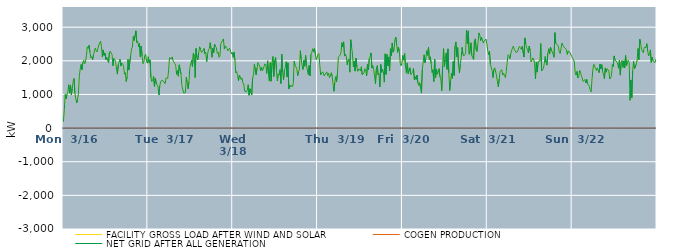
| Category | FACILITY GROSS LOAD AFTER WIND AND SOLAR | COGEN PRODUCTION | NET GRID AFTER ALL GENERATION |
|---|---|---|---|
|  Mon  3/16 | 190 | 0 | 190 |
|  Mon  3/16 | 551 | 0 | 551 |
|  Mon  3/16 | 998 | 0 | 998 |
|  Mon  3/16 | 871 | 0 | 871 |
|  Mon  3/16 | 998 | 0 | 998 |
|  Mon  3/16 | 1071 | 0 | 1071 |
|  Mon  3/16 | 1289 | 0 | 1289 |
|  Mon  3/16 | 1038 | 0 | 1038 |
|  Mon  3/16 | 1282 | 0 | 1282 |
|  Mon  3/16 | 989 | 0 | 989 |
|  Mon  3/16 | 1173 | 0 | 1173 |
|  Mon  3/16 | 1390 | 0 | 1390 |
|  Mon  3/16 | 1475 | 0 | 1475 |
|  Mon  3/16 | 1033 | 0 | 1033 |
|  Mon  3/16 | 872 | 0 | 872 |
|  Mon  3/16 | 748 | 0 | 748 |
|  Mon  3/16 | 854 | 0 | 854 |
|  Mon  3/16 | 1032 | 0 | 1032 |
|  Mon  3/16 | 1557 | 0 | 1557 |
|  Mon  3/16 | 1759 | 0 | 1759 |
|  Mon  3/16 | 1892 | 0 | 1892 |
|  Mon  3/16 | 1732 | 0 | 1732 |
|  Mon  3/16 | 1958 | 0 | 1958 |
|  Mon  3/16 | 2014 | 0 | 2014 |
|  Mon  3/16 | 1913 | 0 | 1913 |
|  Mon  3/16 | 1969 | 0 | 1969 |
|  Mon  3/16 | 2160 | 0 | 2160 |
|  Mon  3/16 | 2418 | 0 | 2418 |
|  Mon  3/16 | 2363 | 0 | 2363 |
|  Mon  3/16 | 2465 | 0 | 2465 |
|  Mon  3/16 | 2259 | 0 | 2259 |
|  Mon  3/16 | 2088 | 0 | 2088 |
|  Mon  3/16 | 2123 | 0 | 2123 |
|  Mon  3/16 | 2036 | 0 | 2036 |
|  Mon  3/16 | 2182 | 0 | 2182 |
|  Mon  3/16 | 2191 | 0 | 2191 |
|  Mon  3/16 | 2376 | 0 | 2376 |
|  Mon  3/16 | 2309 | 0 | 2309 |
|  Mon  3/16 | 2264 | 0 | 2264 |
|  Mon  3/16 | 2263 | 0 | 2263 |
|  Mon  3/16 | 2470 | 0 | 2470 |
|  Mon  3/16 | 2488 | 0 | 2488 |
|  Mon  3/16 | 2583 | 0 | 2583 |
|  Mon  3/16 | 2424 | 0 | 2424 |
|  Mon  3/16 | 2116 | 0 | 2116 |
|  Mon  3/16 | 2325 | 0 | 2325 |
|  Mon  3/16 | 2159 | 0 | 2159 |
|  Mon  3/16 | 2233 | 0 | 2233 |
|  Mon  3/16 | 2036 | 0 | 2036 |
|  Mon  3/16 | 2106 | 0 | 2106 |
|  Mon  3/16 | 2078 | 0 | 2078 |
|  Mon  3/16 | 1945 | 0 | 1945 |
|  Mon  3/16 | 2255 | 0 | 2255 |
|  Mon  3/16 | 2286 | 0 | 2286 |
|  Mon  3/16 | 2234 | 0 | 2234 |
|  Mon  3/16 | 2187 | 0 | 2187 |
|  Mon  3/16 | 1850 | 0 | 1850 |
|  Mon  3/16 | 2072 | 0 | 2072 |
|  Mon  3/16 | 2038 | 0 | 2038 |
|  Mon  3/16 | 1955 | 0 | 1955 |
|  Mon  3/16 | 1940 | 0 | 1940 |
|  Mon  3/16 | 1604 | 0 | 1604 |
|  Mon  3/16 | 1877 | 0 | 1877 |
|  Mon  3/16 | 1871 | 0 | 1871 |
|  Mon  3/16 | 2046 | 0 | 2046 |
|  Mon  3/16 | 1844 | 0 | 1844 |
|  Mon  3/16 | 1937 | 0 | 1937 |
|  Mon  3/16 | 1966 | 0 | 1966 |
|  Mon  3/16 | 1861 | 0 | 1861 |
|  Mon  3/16 | 1603 | 0 | 1603 |
|  Mon  3/16 | 1648 | 0 | 1648 |
|  Mon  3/16 | 1384 | 0 | 1384 |
|  Mon  3/16 | 1517 | 0 | 1517 |
|  Mon  3/16 | 2045 | 0 | 2045 |
|  Mon  3/16 | 1724 | 0 | 1724 |
|  Mon  3/16 | 1749 | 0 | 1749 |
|  Mon  3/16 | 2150 | 0 | 2150 |
|  Mon  3/16 | 2346 | 0 | 2346 |
|  Mon  3/16 | 2409 | 0 | 2409 |
|  Mon  3/16 | 2723 | 0 | 2723 |
|  Mon  3/16 | 2602 | 0 | 2602 |
|  Mon  3/16 | 2599 | 0 | 2599 |
|  Mon  3/16 | 2892 | 0 | 2892 |
|  Mon  3/16 | 2543 | 0 | 2543 |
|  Mon  3/16 | 2584 | 0 | 2584 |
|  Mon  3/16 | 2419 | 0 | 2419 |
|  Mon  3/16 | 2514 | 0 | 2514 |
|  Mon  3/16 | 2117 | 0 | 2117 |
|  Mon  3/16 | 2440 | 0 | 2440 |
|  Mon  3/16 | 2133 | 0 | 2133 |
|  Mon  3/16 | 1913 | 0 | 1913 |
|  Mon  3/16 | 1972 | 0 | 1972 |
|  Mon  3/16 | 2156 | 0 | 2156 |
|  Mon  3/16 | 2198 | 0 | 2198 |
|  Mon  3/16 | 1978 | 0 | 1978 |
|  Mon  3/16 | 1931 | 0 | 1931 |
|  Tue  3/17 | 2121 | 0 | 2121 |
|  Tue  3/17 | 1933 | 0 | 1933 |
|  Tue  3/17 | 2028 | 0 | 2028 |
|  Tue  3/17 | 1499 | 0 | 1499 |
|  Tue  3/17 | 1384 | 0 | 1384 |
|  Tue  3/17 | 1421 | 0 | 1421 |
|  Tue  3/17 | 1540 | 0 | 1540 |
|  Tue  3/17 | 1237 | 0 | 1237 |
|  Tue  3/17 | 1482 | 0 | 1482 |
|  Tue  3/17 | 1341 | 0 | 1341 |
|  Tue  3/17 | 1277 | 0 | 1277 |
|  Tue  3/17 | 1228 | 0 | 1228 |
|  Tue  3/17 | 984 | 0 | 984 |
|  Tue  3/17 | 1266 | 0 | 1266 |
|  Tue  3/17 | 1383 | 0 | 1383 |
|  Tue  3/17 | 1419 | 0 | 1419 |
|  Tue  3/17 | 1399 | 0 | 1399 |
|  Tue  3/17 | 1397 | 0 | 1397 |
|  Tue  3/17 | 1389 | 0 | 1389 |
|  Tue  3/17 | 1321 | 0 | 1321 |
|  Tue  3/17 | 1488 | 0 | 1488 |
|  Tue  3/17 | 1466 | 0 | 1466 |
|  Tue  3/17 | 1480 | 0 | 1480 |
|  Tue  3/17 | 1721 | 0 | 1721 |
|  Tue  3/17 | 2093 | 0 | 2093 |
|  Tue  3/17 | 2068 | 0 | 2068 |
|  Tue  3/17 | 2057 | 0 | 2057 |
|  Tue  3/17 | 2117 | 0 | 2117 |
|  Tue  3/17 | 2003 | 0 | 2003 |
|  Tue  3/17 | 2019 | 0 | 2019 |
|  Tue  3/17 | 1918 | 0 | 1918 |
|  Tue  3/17 | 1860 | 0 | 1860 |
|  Tue  3/17 | 1598 | 0 | 1598 |
|  Tue  3/17 | 1708 | 0 | 1708 |
|  Tue  3/17 | 1542 | 0 | 1542 |
|  Tue  3/17 | 1881 | 0 | 1881 |
|  Tue  3/17 | 1890 | 0 | 1890 |
|  Tue  3/17 | 1606 | 0 | 1606 |
|  Tue  3/17 | 1262 | 0 | 1262 |
|  Tue  3/17 | 1269 | 0 | 1269 |
|  Tue  3/17 | 1046 | 0 | 1046 |
|  Tue  3/17 | 1018 | 0 | 1018 |
|  Tue  3/17 | 1055 | 0 | 1055 |
|  Tue  3/17 | 1518 | 0 | 1518 |
|  Tue  3/17 | 1353 | 0 | 1353 |
|  Tue  3/17 | 1169 | 0 | 1169 |
|  Tue  3/17 | 1368 | 0 | 1368 |
|  Tue  3/17 | 1798 | 0 | 1798 |
|  Tue  3/17 | 1904 | 0 | 1904 |
|  Tue  3/17 | 2016 | 0 | 2016 |
|  Tue  3/17 | 1831 | 0 | 1831 |
|  Tue  3/17 | 2224 | 0 | 2224 |
|  Tue  3/17 | 2151 | 0 | 2151 |
|  Tue  3/17 | 1502 | 0 | 1502 |
|  Tue  3/17 | 2368 | 0 | 2368 |
|  Tue  3/17 | 2102 | 0 | 2102 |
|  Tue  3/17 | 2030 | 0 | 2030 |
|  Tue  3/17 | 2228 | 0 | 2228 |
|  Tue  3/17 | 2414 | 0 | 2414 |
|  Tue  3/17 | 2346 | 0 | 2346 |
|  Tue  3/17 | 2252 | 0 | 2252 |
|  Tue  3/17 | 2233 | 0 | 2233 |
|  Tue  3/17 | 2293 | 0 | 2293 |
|  Tue  3/17 | 2368 | 0 | 2368 |
|  Tue  3/17 | 2205 | 0 | 2205 |
|  Tue  3/17 | 2253 | 0 | 2253 |
|  Tue  3/17 | 1973 | 0 | 1973 |
|  Tue  3/17 | 2182 | 0 | 2182 |
|  Tue  3/17 | 2325 | 0 | 2325 |
|  Tue  3/17 | 2359 | 0 | 2359 |
|  Tue  3/17 | 2540 | 0 | 2540 |
|  Tue  3/17 | 2353 | 0 | 2353 |
|  Tue  3/17 | 2105 | 0 | 2105 |
|  Tue  3/17 | 2376 | 0 | 2376 |
|  Tue  3/17 | 2242 | 0 | 2242 |
|  Tue  3/17 | 2491 | 0 | 2491 |
|  Tue  3/17 | 2427 | 0 | 2427 |
|  Tue  3/17 | 2390 | 0 | 2390 |
|  Tue  3/17 | 2221 | 0 | 2221 |
|  Tue  3/17 | 2259 | 0 | 2259 |
|  Tue  3/17 | 2106 | 0 | 2106 |
|  Tue  3/17 | 2139 | 0 | 2139 |
|  Tue  3/17 | 2513 | 0 | 2513 |
|  Tue  3/17 | 2520 | 0 | 2520 |
|  Tue  3/17 | 2606 | 0 | 2606 |
|  Tue  3/17 | 2653 | 0 | 2653 |
|  Tue  3/17 | 2350 | 0 | 2350 |
|  Tue  3/17 | 2443 | 0 | 2443 |
|  Tue  3/17 | 2464 | 0 | 2464 |
|  Tue  3/17 | 2363 | 0 | 2363 |
|  Tue  3/17 | 2297 | 0 | 2297 |
|  Tue  3/17 | 2295 | 0 | 2295 |
|  Tue  3/17 | 2374 | 0 | 2374 |
|  Tue  3/17 | 2354 | 0 | 2354 |
|  Tue  3/17 | 2205 | 0 | 2205 |
|  Tue  3/17 | 2246 | 0 | 2246 |
|  Wed  3/18 | 2103 | 0 | 2103 |
|  Wed  3/18 | 2259 | 0 | 2259 |
|  Wed  3/18 | 2031 | 0 | 2031 |
|  Wed  3/18 | 1640 | 0 | 1640 |
|  Wed  3/18 | 1681 | 0 | 1681 |
|  Wed  3/18 | 1561 | 0 | 1561 |
|  Wed  3/18 | 1412 | 0 | 1412 |
|  Wed  3/18 | 1575 | 0 | 1575 |
|  Wed  3/18 | 1539 | 0 | 1539 |
|  Wed  3/18 | 1445 | 0 | 1445 |
|  Wed  3/18 | 1490 | 0 | 1490 |
|  Wed  3/18 | 1343 | 0 | 1343 |
|  Wed  3/18 | 1310 | 0 | 1310 |
|  Wed  3/18 | 1099 | 0 | 1099 |
|  Wed  3/18 | 1074 | 0 | 1074 |
|  Wed  3/18 | 1073 | 0 | 1073 |
|  Wed  3/18 | 1130 | 0 | 1130 |
|  Wed  3/18 | 1291 | 0 | 1291 |
|  Wed  3/18 | 975 | 0 | 975 |
|  Wed  3/18 | 1171 | 0 | 1171 |
|  Wed  3/18 | 1143 | 0 | 1143 |
|  Wed  3/18 | 984 | 0 | 984 |
|  Wed  3/18 | 1482 | 0 | 1482 |
|  Wed  3/18 | 1587 | 0 | 1587 |
|  Wed  3/18 | 1894 | 0 | 1894 |
|  Wed  3/18 | 1888 | 0 | 1888 |
|  Wed  3/18 | 1586 | 0 | 1586 |
|  Wed  3/18 | 1784 | 0 | 1784 |
|  Wed  3/18 | 1950 | 0 | 1950 |
|  Wed  3/18 | 1889 | 0 | 1889 |
|  Wed  3/18 | 1839 | 0 | 1839 |
|  Wed  3/18 | 1712 | 0 | 1712 |
|  Wed  3/18 | 1816 | 0 | 1816 |
|  Wed  3/18 | 1709 | 0 | 1709 |
|  Wed  3/18 | 1750 | 0 | 1750 |
|  Wed  3/18 | 1841 | 0 | 1841 |
|  Wed  3/18 | 1909 | 0 | 1909 |
|  Wed  3/18 | 1874 | 0 | 1874 |
|  Wed  3/18 | 1627 | 0 | 1627 |
|  Wed  3/18 | 1999 | 0 | 1999 |
|  Wed  3/18 | 1989 | 0 | 1989 |
|  Wed  3/18 | 1397 | 0 | 1397 |
|  Wed  3/18 | 1945 | 0 | 1945 |
|  Wed  3/18 | 1393 | 0 | 1393 |
|  Wed  3/18 | 1947 | 0 | 1947 |
|  Wed  3/18 | 2129 | 0 | 2129 |
|  Wed  3/18 | 1534 | 0 | 1534 |
|  Wed  3/18 | 1994 | 0 | 1994 |
|  Wed  3/18 | 2101 | 0 | 2101 |
|  Wed  3/18 | 1716 | 0 | 1716 |
|  Wed  3/18 | 1402 | 0 | 1402 |
|  Wed  3/18 | 1612 | 0 | 1612 |
|  Wed  3/18 | 1582 | 0 | 1582 |
|  Wed  3/18 | 1740 | 0 | 1740 |
|  Wed  3/18 | 1324 | 0 | 1324 |
|  Wed  3/18 | 2195 | 0 | 2195 |
|  Wed  3/18 | 1665 | 0 | 1665 |
|  Wed  3/18 | 1440 | 0 | 1440 |
|  Wed  3/18 | 1716 | 0 | 1716 |
|  Wed  3/18 | 1804 | 0 | 1804 |
|  Wed  3/18 | 1973 | 0 | 1973 |
|  Wed  3/18 | 1518 | 0 | 1518 |
|  Wed  3/18 | 1942 | 0 | 1942 |
|  Wed  3/18 | 1163 | 0 | 1163 |
|  Wed  3/18 | 1284 | 0 | 1284 |
|  Wed  3/18 | 1229 | 0 | 1229 |
|  Wed  3/18 | 1265 | 0 | 1265 |
|  Wed  3/18 | 1228 | 0 | 1228 |
|  Wed  3/18 | 1322 | 0 | 1322 |
|  Wed  3/18 | 1987 | 0 | 1987 |
|  Wed  3/18 | 1869 | 0 | 1869 |
|  Wed  3/18 | 1844 | 0 | 1844 |
|  Wed  3/18 | 1769 | 0 | 1769 |
|  Wed  3/18 | 1560 | 0 | 1560 |
|  Wed  3/18 | 1673 | 0 | 1673 |
|  Wed  3/18 | 1752 | 0 | 1752 |
|  Wed  3/18 | 2300 | 0 | 2300 |
|  Wed  3/18 | 2047 | 0 | 2047 |
|  Wed  3/18 | 1862 | 0 | 1862 |
|  Wed  3/18 | 1741 | 0 | 1741 |
|  Wed  3/18 | 2011 | 0 | 2011 |
|  Wed  3/18 | 1838 | 0 | 1838 |
|  Wed  3/18 | 2158 | 0 | 2158 |
|  Wed  3/18 | 1860 | 0 | 1860 |
|  Wed  3/18 | 1843 | 0 | 1843 |
|  Wed  3/18 | 1590 | 0 | 1590 |
|  Wed  3/18 | 1861 | 0 | 1861 |
|  Wed  3/18 | 1552 | 0 | 1552 |
|  Wed  3/18 | 2191 | 0 | 2191 |
|  Wed  3/18 | 2252 | 0 | 2252 |
|  Wed  3/18 | 2358 | 0 | 2358 |
|  Wed  3/18 | 2265 | 0 | 2265 |
|  Wed  3/18 | 2363 | 0 | 2363 |
|  Wed  3/18 | 2200 | 0 | 2200 |
|  Wed  3/18 | 2038 | 0 | 2038 |
|  Wed  3/18 | 2098 | 0 | 2098 |
|  Thu  3/19 | 2187 | 0 | 2187 |
|  Thu  3/19 | 2217 | 0 | 2217 |
|  Thu  3/19 | 1882 | 0 | 1882 |
|  Thu  3/19 | 1579 | 0 | 1579 |
|  Thu  3/19 | 1596 | 0 | 1596 |
|  Thu  3/19 | 1674 | 0 | 1674 |
|  Thu  3/19 | 1641 | 0 | 1641 |
|  Thu  3/19 | 1548 | 0 | 1548 |
|  Thu  3/19 | 1599 | 0 | 1599 |
|  Thu  3/19 | 1617 | 0 | 1617 |
|  Thu  3/19 | 1672 | 0 | 1672 |
|  Thu  3/19 | 1560 | 0 | 1560 |
|  Thu  3/19 | 1632 | 0 | 1632 |
|  Thu  3/19 | 1493 | 0 | 1493 |
|  Thu  3/19 | 1538 | 0 | 1538 |
|  Thu  3/19 | 1645 | 0 | 1645 |
|  Thu  3/19 | 1543 | 0 | 1543 |
|  Thu  3/19 | 1544 | 0 | 1544 |
|  Thu  3/19 | 1095 | 0 | 1095 |
|  Thu  3/19 | 1359 | 0 | 1359 |
|  Thu  3/19 | 1528 | 0 | 1528 |
|  Thu  3/19 | 1380 | 0 | 1380 |
|  Thu  3/19 | 1621 | 0 | 1621 |
|  Thu  3/19 | 2106 | 0 | 2106 |
|  Thu  3/19 | 2078 | 0 | 2078 |
|  Thu  3/19 | 2171 | 0 | 2171 |
|  Thu  3/19 | 2244 | 0 | 2244 |
|  Thu  3/19 | 2541 | 0 | 2541 |
|  Thu  3/19 | 2413 | 0 | 2413 |
|  Thu  3/19 | 2566 | 0 | 2566 |
|  Thu  3/19 | 2140 | 0 | 2140 |
|  Thu  3/19 | 2201 | 0 | 2201 |
|  Thu  3/19 | 2136 | 0 | 2136 |
|  Thu  3/19 | 1883 | 0 | 1883 |
|  Thu  3/19 | 2012 | 0 | 2012 |
|  Thu  3/19 | 2058 | 0 | 2058 |
|  Thu  3/19 | 1662 | 0 | 1662 |
|  Thu  3/19 | 2627 | 0 | 2627 |
|  Thu  3/19 | 2416 | 0 | 2416 |
|  Thu  3/19 | 2197 | 0 | 2197 |
|  Thu  3/19 | 1823 | 0 | 1823 |
|  Thu  3/19 | 1993 | 0 | 1993 |
|  Thu  3/19 | 1693 | 0 | 1693 |
|  Thu  3/19 | 2083 | 0 | 2083 |
|  Thu  3/19 | 1817 | 0 | 1817 |
|  Thu  3/19 | 1687 | 0 | 1687 |
|  Thu  3/19 | 1763 | 0 | 1763 |
|  Thu  3/19 | 1785 | 0 | 1785 |
|  Thu  3/19 | 1702 | 0 | 1702 |
|  Thu  3/19 | 1824 | 0 | 1824 |
|  Thu  3/19 | 1588 | 0 | 1588 |
|  Thu  3/19 | 1584 | 0 | 1584 |
|  Thu  3/19 | 1639 | 0 | 1639 |
|  Thu  3/19 | 1766 | 0 | 1766 |
|  Thu  3/19 | 1735 | 0 | 1735 |
|  Thu  3/19 | 1551 | 0 | 1551 |
|  Thu  3/19 | 1897 | 0 | 1897 |
|  Thu  3/19 | 1733 | 0 | 1733 |
|  Thu  3/19 | 2065 | 0 | 2065 |
|  Thu  3/19 | 2134 | 0 | 2134 |
|  Thu  3/19 | 2237 | 0 | 2237 |
|  Thu  3/19 | 1783 | 0 | 1783 |
|  Thu  3/19 | 1857 | 0 | 1857 |
|  Thu  3/19 | 1744 | 0 | 1744 |
|  Thu  3/19 | 1537 | 0 | 1537 |
|  Thu  3/19 | 1321 | 0 | 1321 |
|  Thu  3/19 | 1748 | 0 | 1748 |
|  Thu  3/19 | 1858 | 0 | 1858 |
|  Thu  3/19 | 1582 | 0 | 1582 |
|  Thu  3/19 | 1615 | 0 | 1615 |
|  Thu  3/19 | 1223 | 0 | 1223 |
|  Thu  3/19 | 1890 | 0 | 1890 |
|  Thu  3/19 | 1655 | 0 | 1655 |
|  Thu  3/19 | 1754 | 0 | 1754 |
|  Thu  3/19 | 1670 | 0 | 1670 |
|  Thu  3/19 | 1365 | 0 | 1365 |
|  Thu  3/19 | 2209 | 0 | 2209 |
|  Thu  3/19 | 1595 | 0 | 1595 |
|  Thu  3/19 | 2191 | 0 | 2191 |
|  Thu  3/19 | 1849 | 0 | 1849 |
|  Thu  3/19 | 2116 | 0 | 2116 |
|  Thu  3/19 | 1708 | 0 | 1708 |
|  Thu  3/19 | 2359 | 0 | 2359 |
|  Thu  3/19 | 2144 | 0 | 2144 |
|  Thu  3/19 | 2532 | 0 | 2532 |
|  Thu  3/19 | 2256 | 0 | 2256 |
|  Thu  3/19 | 2340 | 0 | 2340 |
|  Thu  3/19 | 2635 | 0 | 2635 |
|  Thu  3/19 | 2705 | 0 | 2705 |
|  Thu  3/19 | 2483 | 0 | 2483 |
|  Thu  3/19 | 2248 | 0 | 2248 |
|  Thu  3/19 | 2410 | 0 | 2410 |
|  Thu  3/19 | 2279 | 0 | 2279 |
|  Thu  3/19 | 1927 | 0 | 1927 |
|  Thu  3/19 | 1854 | 0 | 1854 |
|  Thu  3/19 | 1941 | 0 | 1941 |
|  Fri  3/20 | 2161 | 0 | 2161 |
|  Fri  3/20 | 2020 | 0 | 2020 |
|  Fri  3/20 | 2217 | 0 | 2217 |
|  Fri  3/20 | 1818 | 0 | 1818 |
|  Fri  3/20 | 1633 | 0 | 1633 |
|  Fri  3/20 | 1937 | 0 | 1937 |
|  Fri  3/20 | 1617 | 0 | 1617 |
|  Fri  3/20 | 1646 | 0 | 1646 |
|  Fri  3/20 | 1792 | 0 | 1792 |
|  Fri  3/20 | 1596 | 0 | 1596 |
|  Fri  3/20 | 1613 | 0 | 1613 |
|  Fri  3/20 | 1654 | 0 | 1654 |
|  Fri  3/20 | 1772 | 0 | 1772 |
|  Fri  3/20 | 1441 | 0 | 1441 |
|  Fri  3/20 | 1527 | 0 | 1527 |
|  Fri  3/20 | 1442 | 0 | 1442 |
|  Fri  3/20 | 1572 | 0 | 1572 |
|  Fri  3/20 | 1341 | 0 | 1341 |
|  Fri  3/20 | 1268 | 0 | 1268 |
|  Fri  3/20 | 1349 | 0 | 1349 |
|  Fri  3/20 | 1195 | 0 | 1195 |
|  Fri  3/20 | 1040 | 0 | 1040 |
|  Fri  3/20 | 1746 | 0 | 1746 |
|  Fri  3/20 | 1768 | 0 | 1768 |
|  Fri  3/20 | 2179 | 0 | 2179 |
|  Fri  3/20 | 1943 | 0 | 1943 |
|  Fri  3/20 | 2072 | 0 | 2072 |
|  Fri  3/20 | 2302 | 0 | 2302 |
|  Fri  3/20 | 2161 | 0 | 2161 |
|  Fri  3/20 | 2401 | 0 | 2401 |
|  Fri  3/20 | 2031 | 0 | 2031 |
|  Fri  3/20 | 2119 | 0 | 2119 |
|  Fri  3/20 | 1912 | 0 | 1912 |
|  Fri  3/20 | 1656 | 0 | 1656 |
|  Fri  3/20 | 1733 | 0 | 1733 |
|  Fri  3/20 | 1383 | 0 | 1383 |
|  Fri  3/20 | 2042 | 0 | 2042 |
|  Fri  3/20 | 1496 | 0 | 1496 |
|  Fri  3/20 | 1757 | 0 | 1757 |
|  Fri  3/20 | 1598 | 0 | 1598 |
|  Fri  3/20 | 1656 | 0 | 1656 |
|  Fri  3/20 | 1768 | 0 | 1768 |
|  Fri  3/20 | 1517 | 0 | 1517 |
|  Fri  3/20 | 1453 | 0 | 1453 |
|  Fri  3/20 | 1114 | 0 | 1114 |
|  Fri  3/20 | 1847 | 0 | 1847 |
|  Fri  3/20 | 2364 | 0 | 2364 |
|  Fri  3/20 | 1823 | 0 | 1823 |
|  Fri  3/20 | 2043 | 0 | 2043 |
|  Fri  3/20 | 2236 | 0 | 2236 |
|  Fri  3/20 | 1745 | 0 | 1745 |
|  Fri  3/20 | 2356 | 0 | 2356 |
|  Fri  3/20 | 1640 | 0 | 1640 |
|  Fri  3/20 | 1119 | 0 | 1119 |
|  Fri  3/20 | 1400 | 0 | 1400 |
|  Fri  3/20 | 1628 | 0 | 1628 |
|  Fri  3/20 | 1478 | 0 | 1478 |
|  Fri  3/20 | 1977 | 0 | 1977 |
|  Fri  3/20 | 1564 | 0 | 1564 |
|  Fri  3/20 | 2436 | 0 | 2436 |
|  Fri  3/20 | 2562 | 0 | 2562 |
|  Fri  3/20 | 2119 | 0 | 2119 |
|  Fri  3/20 | 2392 | 0 | 2392 |
|  Fri  3/20 | 1854 | 0 | 1854 |
|  Fri  3/20 | 1637 | 0 | 1637 |
|  Fri  3/20 | 1907 | 0 | 1907 |
|  Fri  3/20 | 2096 | 0 | 2096 |
|  Fri  3/20 | 2402 | 0 | 2402 |
|  Fri  3/20 | 2182 | 0 | 2182 |
|  Fri  3/20 | 2146 | 0 | 2146 |
|  Fri  3/20 | 2130 | 0 | 2130 |
|  Fri  3/20 | 2225 | 0 | 2225 |
|  Fri  3/20 | 2913 | 0 | 2913 |
|  Fri  3/20 | 2510 | 0 | 2510 |
|  Fri  3/20 | 2891 | 0 | 2891 |
|  Fri  3/20 | 2192 | 0 | 2192 |
|  Fri  3/20 | 2237 | 0 | 2237 |
|  Fri  3/20 | 2538 | 0 | 2538 |
|  Fri  3/20 | 2154 | 0 | 2154 |
|  Fri  3/20 | 2129 | 0 | 2129 |
|  Fri  3/20 | 2040 | 0 | 2040 |
|  Fri  3/20 | 2589 | 0 | 2589 |
|  Fri  3/20 | 2657 | 0 | 2657 |
|  Fri  3/20 | 2320 | 0 | 2320 |
|  Fri  3/20 | 2270 | 0 | 2270 |
|  Fri  3/20 | 2544 | 0 | 2544 |
|  Fri  3/20 | 2830 | 0 | 2830 |
|  Fri  3/20 | 2767 | 0 | 2767 |
|  Fri  3/20 | 2600 | 0 | 2600 |
|  Fri  3/20 | 2700 | 0 | 2700 |
|  Fri  3/20 | 2620 | 0 | 2620 |
|  Fri  3/20 | 2529 | 0 | 2529 |
|  Fri  3/20 | 2590 | 0 | 2590 |
|  Fri  3/20 | 2576 | 0 | 2576 |
|  Fri  3/20 | 2646 | 0 | 2646 |
|  Fri  3/20 | 2517 | 0 | 2517 |
|  Sat  3/21 | 2306 | 0 | 2306 |
|  Sat  3/21 | 2186 | 0 | 2186 |
|  Sat  3/21 | 2285 | 0 | 2285 |
|  Sat  3/21 | 1893 | 0 | 1893 |
|  Sat  3/21 | 1866 | 0 | 1866 |
|  Sat  3/21 | 1715 | 0 | 1715 |
|  Sat  3/21 | 1501 | 0 | 1501 |
|  Sat  3/21 | 1741 | 0 | 1741 |
|  Sat  3/21 | 1791 | 0 | 1791 |
|  Sat  3/21 | 1810 | 0 | 1810 |
|  Sat  3/21 | 1551 | 0 | 1551 |
|  Sat  3/21 | 1375 | 0 | 1375 |
|  Sat  3/21 | 1225 | 0 | 1225 |
|  Sat  3/21 | 1464 | 0 | 1464 |
|  Sat  3/21 | 1693 | 0 | 1693 |
|  Sat  3/21 | 1666 | 0 | 1666 |
|  Sat  3/21 | 1735 | 0 | 1735 |
|  Sat  3/21 | 1574 | 0 | 1574 |
|  Sat  3/21 | 1626 | 0 | 1626 |
|  Sat  3/21 | 1565 | 0 | 1565 |
|  Sat  3/21 | 1500 | 0 | 1500 |
|  Sat  3/21 | 1684 | 0 | 1684 |
|  Sat  3/21 | 1952 | 0 | 1952 |
|  Sat  3/21 | 2182 | 0 | 2182 |
|  Sat  3/21 | 2150 | 0 | 2150 |
|  Sat  3/21 | 2064 | 0 | 2064 |
|  Sat  3/21 | 2210 | 0 | 2210 |
|  Sat  3/21 | 2299 | 0 | 2299 |
|  Sat  3/21 | 2389 | 0 | 2389 |
|  Sat  3/21 | 2436 | 0 | 2436 |
|  Sat  3/21 | 2344 | 0 | 2344 |
|  Sat  3/21 | 2339 | 0 | 2339 |
|  Sat  3/21 | 2250 | 0 | 2250 |
|  Sat  3/21 | 2230 | 0 | 2230 |
|  Sat  3/21 | 2280 | 0 | 2280 |
|  Sat  3/21 | 2395 | 0 | 2395 |
|  Sat  3/21 | 2430 | 0 | 2430 |
|  Sat  3/21 | 2371 | 0 | 2371 |
|  Sat  3/21 | 2341 | 0 | 2341 |
|  Sat  3/21 | 2432 | 0 | 2432 |
|  Sat  3/21 | 2453 | 0 | 2453 |
|  Sat  3/21 | 2113 | 0 | 2113 |
|  Sat  3/21 | 2682 | 0 | 2682 |
|  Sat  3/21 | 2504 | 0 | 2504 |
|  Sat  3/21 | 2388 | 0 | 2388 |
|  Sat  3/21 | 2333 | 0 | 2333 |
|  Sat  3/21 | 2236 | 0 | 2236 |
|  Sat  3/21 | 2436 | 0 | 2436 |
|  Sat  3/21 | 2303 | 0 | 2303 |
|  Sat  3/21 | 1964 | 0 | 1964 |
|  Sat  3/21 | 2014 | 0 | 2014 |
|  Sat  3/21 | 2088 | 0 | 2088 |
|  Sat  3/21 | 2054 | 0 | 2054 |
|  Sat  3/21 | 1927 | 0 | 1927 |
|  Sat  3/21 | 1464 | 0 | 1464 |
|  Sat  3/21 | 1966 | 0 | 1966 |
|  Sat  3/21 | 1665 | 0 | 1665 |
|  Sat  3/21 | 1968 | 0 | 1968 |
|  Sat  3/21 | 1955 | 0 | 1955 |
|  Sat  3/21 | 1994 | 0 | 1994 |
|  Sat  3/21 | 2514 | 0 | 2514 |
|  Sat  3/21 | 1699 | 0 | 1699 |
|  Sat  3/21 | 1687 | 0 | 1687 |
|  Sat  3/21 | 1771 | 0 | 1771 |
|  Sat  3/21 | 1922 | 0 | 1922 |
|  Sat  3/21 | 2130 | 0 | 2130 |
|  Sat  3/21 | 1945 | 0 | 1945 |
|  Sat  3/21 | 1871 | 0 | 1871 |
|  Sat  3/21 | 2226 | 0 | 2226 |
|  Sat  3/21 | 2358 | 0 | 2358 |
|  Sat  3/21 | 2202 | 0 | 2202 |
|  Sat  3/21 | 2408 | 0 | 2408 |
|  Sat  3/21 | 2323 | 0 | 2323 |
|  Sat  3/21 | 2316 | 0 | 2316 |
|  Sat  3/21 | 2194 | 0 | 2194 |
|  Sat  3/21 | 2106 | 0 | 2106 |
|  Sat  3/21 | 2839 | 0 | 2839 |
|  Sat  3/21 | 2515 | 0 | 2515 |
|  Sat  3/21 | 2530 | 0 | 2530 |
|  Sat  3/21 | 2473 | 0 | 2473 |
|  Sat  3/21 | 2416 | 0 | 2416 |
|  Sat  3/21 | 2264 | 0 | 2264 |
|  Sat  3/21 | 2219 | 0 | 2219 |
|  Sat  3/21 | 2378 | 0 | 2378 |
|  Sat  3/21 | 2531 | 0 | 2531 |
|  Sat  3/21 | 2461 | 0 | 2461 |
|  Sat  3/21 | 2459 | 0 | 2459 |
|  Sat  3/21 | 2385 | 0 | 2385 |
|  Sat  3/21 | 2386 | 0 | 2386 |
|  Sat  3/21 | 2337 | 0 | 2337 |
|  Sat  3/21 | 2191 | 0 | 2191 |
|  Sat  3/21 | 2290 | 0 | 2290 |
|  Sat  3/21 | 2280 | 0 | 2280 |
|  Sat  3/21 | 2252 | 0 | 2252 |
|  Sat  3/21 | 2259 | 0 | 2259 |
|  Sat  3/21 | 2127 | 0 | 2127 |
|  Sun  3/22 | 2101 | 0 | 2101 |
|  Sun  3/22 | 2037 | 0 | 2037 |
|  Sun  3/22 | 1964 | 0 | 1964 |
|  Sun  3/22 | 1637 | 0 | 1637 |
|  Sun  3/22 | 1572 | 0 | 1572 |
|  Sun  3/22 | 1687 | 0 | 1687 |
|  Sun  3/22 | 1487 | 0 | 1487 |
|  Sun  3/22 | 1533 | 0 | 1533 |
|  Sun  3/22 | 1717 | 0 | 1717 |
|  Sun  3/22 | 1658 | 0 | 1658 |
|  Sun  3/22 | 1552 | 0 | 1552 |
|  Sun  3/22 | 1574 | 0 | 1574 |
|  Sun  3/22 | 1385 | 0 | 1385 |
|  Sun  3/22 | 1387 | 0 | 1387 |
|  Sun  3/22 | 1447 | 0 | 1447 |
|  Sun  3/22 | 1341 | 0 | 1341 |
|  Sun  3/22 | 1448 | 0 | 1448 |
|  Sun  3/22 | 1318 | 0 | 1318 |
|  Sun  3/22 | 1333 | 0 | 1333 |
|  Sun  3/22 | 1244 | 0 | 1244 |
|  Sun  3/22 | 1128 | 0 | 1128 |
|  Sun  3/22 | 1077 | 0 | 1077 |
|  Sun  3/22 | 1463 | 0 | 1463 |
|  Sun  3/22 | 1748 | 0 | 1748 |
|  Sun  3/22 | 1897 | 0 | 1897 |
|  Sun  3/22 | 1838 | 0 | 1838 |
|  Sun  3/22 | 1779 | 0 | 1779 |
|  Sun  3/22 | 1711 | 0 | 1711 |
|  Sun  3/22 | 1788 | 0 | 1788 |
|  Sun  3/22 | 1759 | 0 | 1759 |
|  Sun  3/22 | 1647 | 0 | 1647 |
|  Sun  3/22 | 1903 | 0 | 1903 |
|  Sun  3/22 | 1758 | 0 | 1758 |
|  Sun  3/22 | 1885 | 0 | 1885 |
|  Sun  3/22 | 1685 | 0 | 1685 |
|  Sun  3/22 | 1588 | 0 | 1588 |
|  Sun  3/22 | 1460 | 0 | 1460 |
|  Sun  3/22 | 1790 | 0 | 1790 |
|  Sun  3/22 | 1662 | 0 | 1662 |
|  Sun  3/22 | 1763 | 0 | 1763 |
|  Sun  3/22 | 1758 | 0 | 1758 |
|  Sun  3/22 | 1716 | 0 | 1716 |
|  Sun  3/22 | 1459 | 0 | 1459 |
|  Sun  3/22 | 1493 | 0 | 1493 |
|  Sun  3/22 | 1562 | 0 | 1562 |
|  Sun  3/22 | 1887 | 0 | 1887 |
|  Sun  3/22 | 1830 | 0 | 1830 |
|  Sun  3/22 | 2146 | 0 | 2146 |
|  Sun  3/22 | 2029 | 0 | 2029 |
|  Sun  3/22 | 2002 | 0 | 2002 |
|  Sun  3/22 | 1966 | 0 | 1966 |
|  Sun  3/22 | 1909 | 0 | 1909 |
|  Sun  3/22 | 1781 | 0 | 1781 |
|  Sun  3/22 | 2015 | 0 | 2015 |
|  Sun  3/22 | 1574 | 0 | 1574 |
|  Sun  3/22 | 1958 | 0 | 1958 |
|  Sun  3/22 | 2013 | 0 | 2013 |
|  Sun  3/22 | 1800 | 0 | 1800 |
|  Sun  3/22 | 1998 | 0 | 1998 |
|  Sun  3/22 | 1793 | 0 | 1793 |
|  Sun  3/22 | 2158 | 0 | 2158 |
|  Sun  3/22 | 1851 | 0 | 1851 |
|  Sun  3/22 | 1953 | 0 | 1953 |
|  Sun  3/22 | 2015 | 0 | 2015 |
|  Sun  3/22 | 1945 | 0 | 1945 |
|  Sun  3/22 | 826 | 0 | 826 |
|  Sun  3/22 | 1431 | 0 | 1431 |
|  Sun  3/22 | 900 | 0 | 900 |
|  Sun  3/22 | 1710 | 0 | 1710 |
|  Sun  3/22 | 1990 | 0 | 1990 |
|  Sun  3/22 | 1758 | 0 | 1758 |
|  Sun  3/22 | 1749 | 0 | 1749 |
|  Sun  3/22 | 1900 | 0 | 1900 |
|  Sun  3/22 | 2018 | 0 | 2018 |
|  Sun  3/22 | 2365 | 0 | 2365 |
|  Sun  3/22 | 2034 | 0 | 2034 |
|  Sun  3/22 | 2644 | 0 | 2644 |
|  Sun  3/22 | 2516 | 0 | 2516 |
|  Sun  3/22 | 2330 | 0 | 2330 |
|  Sun  3/22 | 2334 | 0 | 2334 |
|  Sun  3/22 | 2242 | 0 | 2242 |
|  Sun  3/22 | 2395 | 0 | 2395 |
|  Sun  3/22 | 2387 | 0 | 2387 |
|  Sun  3/22 | 2397 | 0 | 2397 |
|  Sun  3/22 | 2510 | 0 | 2510 |
|  Sun  3/22 | 2283 | 0 | 2283 |
|  Sun  3/22 | 2145 | 0 | 2145 |
|  Sun  3/22 | 2195 | 0 | 2195 |
|  Sun  3/22 | 2325 | 0 | 2325 |
|  Sun  3/22 | 1954 | 0 | 1954 |
|  Sun  3/22 | 2113 | 0 | 2113 |
|  Sun  3/22 | 2003 | 0 | 2003 |
|  Sun  3/22 | 2018 | 0 | 2018 |
|  Sun  3/22 | 1944 | 0 | 1944 |
|  Sun  3/22 | 1961 | 0 | 1961 |
|  Sun  3/22 | 2081 | 0 | 2081 |